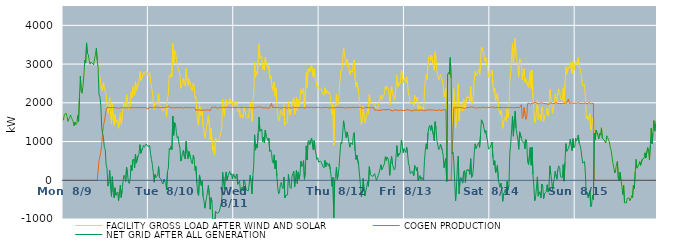
| Category | FACILITY GROSS LOAD AFTER WIND AND SOLAR | COGEN PRODUCTION | NET GRID AFTER ALL GENERATION |
|---|---|---|---|
|  Mon  8/9 | 1549 | 0 | 1549 |
|  Mon  8/9 | 1698 | 0 | 1698 |
|  Mon  8/9 | 1715 | 0 | 1715 |
|  Mon  8/9 | 1729 | 0 | 1729 |
|  Mon  8/9 | 1647 | 0 | 1647 |
|  Mon  8/9 | 1519 | 0 | 1519 |
|  Mon  8/9 | 1544 | 0 | 1544 |
|  Mon  8/9 | 1624 | 0 | 1624 |
|  Mon  8/9 | 1687 | 0 | 1687 |
|  Mon  8/9 | 1622 | 0 | 1622 |
|  Mon  8/9 | 1567 | 0 | 1567 |
|  Mon  8/9 | 1515 | 0 | 1515 |
|  Mon  8/9 | 1407 | 0 | 1407 |
|  Mon  8/9 | 1500 | 0 | 1500 |
|  Mon  8/9 | 1433 | 0 | 1433 |
|  Mon  8/9 | 1461 | 0 | 1461 |
|  Mon  8/9 | 1671 | 0 | 1671 |
|  Mon  8/9 | 1517 | 0 | 1517 |
|  Mon  8/9 | 2141 | 0 | 2141 |
|  Mon  8/9 | 2692 | 0 | 2692 |
|  Mon  8/9 | 2292 | 0 | 2292 |
|  Mon  8/9 | 2245 | 0 | 2245 |
|  Mon  8/9 | 2443 | 0 | 2443 |
|  Mon  8/9 | 2723 | 0 | 2723 |
|  Mon  8/9 | 3099 | 0 | 3099 |
|  Mon  8/9 | 3027 | 0 | 3027 |
|  Mon  8/9 | 3548 | 0 | 3548 |
|  Mon  8/9 | 3280 | 0 | 3280 |
|  Mon  8/9 | 3243 | 0 | 3243 |
|  Mon  8/9 | 3091 | 0 | 3091 |
|  Mon  8/9 | 2999 | 0 | 2999 |
|  Mon  8/9 | 3049 | 0 | 3049 |
|  Mon  8/9 | 3048 | 0 | 3048 |
|  Mon  8/9 | 3018 | 0 | 3018 |
|  Mon  8/9 | 2981 | 0 | 2981 |
|  Mon  8/9 | 3135 | 0 | 3135 |
|  Mon  8/9 | 3249 | 0 | 3249 |
|  Mon  8/9 | 3409 | 0 | 3409 |
|  Mon  8/9 | 3097 | 0 | 3097 |
|  Mon  8/9 | 2904 | 0 | 2904 |
|  Mon  8/9 | 2715 | 510 | 2205 |
|  Mon  8/9 | 2673 | 508 | 2165 |
|  Mon  8/9 | 2664 | 714 | 1950 |
|  Mon  8/9 | 2301 | 919 | 1382 |
|  Mon  8/9 | 2418 | 1216 | 1202 |
|  Mon  8/9 | 2520 | 1412 | 1108 |
|  Mon  8/9 | 2361 | 1520 | 841 |
|  Mon  8/9 | 2311 | 1512 | 799 |
|  Mon  8/9 | 2204 | 1807 | 397 |
|  Mon  8/9 | 2191 | 1880 | 311 |
|  Mon  8/9 | 1725 | 1876 | -151 |
|  Mon  8/9 | 1844 | 1881 | -37 |
|  Mon  8/9 | 2132 | 1875 | 257 |
|  Mon  8/9 | 1702 | 1873 | -171 |
|  Mon  8/9 | 1458 | 1877 | -419 |
|  Mon  8/9 | 1970 | 1877 | 93 |
|  Mon  8/9 | 1567 | 1875 | -308 |
|  Mon  8/9 | 1420 | 1874 | -454 |
|  Mon  8/9 | 1697 | 1892 | -195 |
|  Mon  8/9 | 1483 | 1870 | -387 |
|  Mon  8/9 | 1539 | 1871 | -332 |
|  Mon  8/9 | 1570 | 1872 | -302 |
|  Mon  8/9 | 1341 | 1867 | -526 |
|  Mon  8/9 | 1557 | 1857 | -300 |
|  Mon  8/9 | 1741 | 1864 | -123 |
|  Mon  8/9 | 1444 | 1887 | -443 |
|  Mon  8/9 | 1617 | 1871 | -254 |
|  Mon  8/9 | 1845 | 1868 | -23 |
|  Mon  8/9 | 2013 | 1884 | 129 |
|  Mon  8/9 | 1952 | 1875 | 77 |
|  Mon  8/9 | 1857 | 1889 | -32 |
|  Mon  8/9 | 2208 | 1871 | 337 |
|  Mon  8/9 | 2066 | 1881 | 185 |
|  Mon  8/9 | 1825 | 1872 | -47 |
|  Mon  8/9 | 1801 | 1884 | -83 |
|  Mon  8/9 | 1891 | 1874 | 17 |
|  Mon  8/9 | 2269 | 1884 | 385 |
|  Mon  8/9 | 2128 | 1880 | 248 |
|  Mon  8/9 | 2413 | 1888 | 525 |
|  Mon  8/9 | 2423 | 1871 | 552 |
|  Mon  8/9 | 2184 | 1867 | 317 |
|  Mon  8/9 | 2553 | 1875 | 678 |
|  Mon  8/9 | 2318 | 1876 | 442 |
|  Mon  8/9 | 2337 | 1878 | 459 |
|  Mon  8/9 | 2484 | 1853 | 631 |
|  Mon  8/9 | 2557 | 1871 | 686 |
|  Mon  8/9 | 2810 | 1890 | 920 |
|  Mon  8/9 | 2579 | 1883 | 696 |
|  Mon  8/9 | 2561 | 1867 | 694 |
|  Mon  8/9 | 2705 | 1873 | 832 |
|  Mon  8/9 | 2787 | 1883 | 904 |
|  Mon  8/9 | 2730 | 1876 | 854 |
|  Mon  8/9 | 2799 | 1896 | 903 |
|  Mon  8/9 | 2812 | 1873 | 939 |
|  Mon  8/9 | 2809 | 1879 | 930 |
|  Mon  8/9 | 2712 | 1840 | 872 |
|  Tue  8/10 | 2758 | 1884 | 874 |
|  Tue  8/10 | 2785 | 1892 | 893 |
|  Tue  8/10 | 2564 | 1881 | 683 |
|  Tue  8/10 | 2409 | 1871 | 538 |
|  Tue  8/10 | 2284 | 1875 | 409 |
|  Tue  8/10 | 2048 | 1860 | 188 |
|  Tue  8/10 | 1835 | 1885 | -50 |
|  Tue  8/10 | 2022 | 1870 | 152 |
|  Tue  8/10 | 1964 | 1892 | 72 |
|  Tue  8/10 | 1989 | 1890 | 99 |
|  Tue  8/10 | 2014 | 1873 | 141 |
|  Tue  8/10 | 2239 | 1883 | 356 |
|  Tue  8/10 | 1958 | 1881 | 77 |
|  Tue  8/10 | 1936 | 1879 | 57 |
|  Tue  8/10 | 1887 | 1876 | 11 |
|  Tue  8/10 | 1807 | 1874 | -67 |
|  Tue  8/10 | 1780 | 1876 | -96 |
|  Tue  8/10 | 1897 | 1870 | 27 |
|  Tue  8/10 | 1842 | 1881 | -39 |
|  Tue  8/10 | 1812 | 1893 | -81 |
|  Tue  8/10 | 1635 | 1879 | -244 |
|  Tue  8/10 | 2098 | 1874 | 224 |
|  Tue  8/10 | 2231 | 1915 | 316 |
|  Tue  8/10 | 2707 | 1886 | 821 |
|  Tue  8/10 | 2660 | 1876 | 784 |
|  Tue  8/10 | 2751 | 1871 | 880 |
|  Tue  8/10 | 2669 | 1874 | 795 |
|  Tue  8/10 | 3529 | 1874 | 1655 |
|  Tue  8/10 | 3023 | 1864 | 1159 |
|  Tue  8/10 | 3361 | 1871 | 1490 |
|  Tue  8/10 | 3327 | 1870 | 1457 |
|  Tue  8/10 | 3115 | 1882 | 1233 |
|  Tue  8/10 | 2992 | 1897 | 1095 |
|  Tue  8/10 | 3001 | 1873 | 1128 |
|  Tue  8/10 | 2812 | 1877 | 935 |
|  Tue  8/10 | 2713 | 1876 | 837 |
|  Tue  8/10 | 2373 | 1878 | 495 |
|  Tue  8/10 | 2470 | 1876 | 594 |
|  Tue  8/10 | 2578 | 1863 | 715 |
|  Tue  8/10 | 2643 | 1863 | 780 |
|  Tue  8/10 | 2469 | 1873 | 596 |
|  Tue  8/10 | 2432 | 1884 | 548 |
|  Tue  8/10 | 2890 | 1886 | 1004 |
|  Tue  8/10 | 2577 | 1874 | 703 |
|  Tue  8/10 | 2447 | 1893 | 554 |
|  Tue  8/10 | 2617 | 1872 | 745 |
|  Tue  8/10 | 2611 | 1872 | 739 |
|  Tue  8/10 | 2451 | 1874 | 577 |
|  Tue  8/10 | 2337 | 1878 | 459 |
|  Tue  8/10 | 2303 | 1877 | 426 |
|  Tue  8/10 | 2513 | 1868 | 645 |
|  Tue  8/10 | 2430 | 1883 | 547 |
|  Tue  8/10 | 2130 | 1873 | 257 |
|  Tue  8/10 | 2163 | 1806 | 357 |
|  Tue  8/10 | 1747 | 1812 | -65 |
|  Tue  8/10 | 1475 | 1816 | -341 |
|  Tue  8/10 | 1426 | 1817 | -391 |
|  Tue  8/10 | 1952 | 1814 | 138 |
|  Tue  8/10 | 1928 | 1799 | 129 |
|  Tue  8/10 | 1670 | 1804 | -134 |
|  Tue  8/10 | 1786 | 1811 | -25 |
|  Tue  8/10 | 1395 | 1815 | -420 |
|  Tue  8/10 | 1285 | 1815 | -530 |
|  Tue  8/10 | 1086 | 1807 | -721 |
|  Tue  8/10 | 1249 | 1806 | -557 |
|  Tue  8/10 | 1371 | 1818 | -447 |
|  Tue  8/10 | 1370 | 1811 | -441 |
|  Tue  8/10 | 1681 | 1813 | -132 |
|  Tue  8/10 | 1430 | 1811 | -381 |
|  Tue  8/10 | 1052 | 1800 | -748 |
|  Tue  8/10 | 1347 | 1797 | -450 |
|  Tue  8/10 | 1356 | 1892 | -536 |
|  Tue  8/10 | 762 | 1867 | -1105 |
|  Tue  8/10 | 876 | 1874 | -998 |
|  Tue  8/10 | 651 | 1862 | -1211 |
|  Tue  8/10 | 1095 | 1896 | -801 |
|  Tue  8/10 | 1059 | 1867 | -808 |
|  Tue  8/10 | 1010 | 1865 | -855 |
|  Tue  8/10 | 1009 | 1863 | -854 |
|  Tue  8/10 | 1065 | 1888 | -823 |
|  Tue  8/10 | 1140 | 1887 | -747 |
|  Tue  8/10 | 1129 | 1888 | -759 |
|  Tue  8/10 | 1323 | 1866 | -543 |
|  Tue  8/10 | 2088 | 1874 | 214 |
|  Tue  8/10 | 1830 | 1887 | -57 |
|  Tue  8/10 | 1656 | 1888 | -232 |
|  Tue  8/10 | 1959 | 1873 | 86 |
|  Tue  8/10 | 2089 | 1874 | 215 |
|  Tue  8/10 | 1898 | 1896 | 2 |
|  Tue  8/10 | 1985 | 1872 | 113 |
|  Tue  8/10 | 2012 | 1882 | 130 |
|  Tue  8/10 | 2112 | 1880 | 232 |
|  Tue  8/10 | 2011 | 1872 | 139 |
|  Tue  8/10 | 2057 | 1886 | 171 |
|  Tue  8/10 | 1918 | 1887 | 31 |
|  Tue  8/10 | 2042 | 1877 | 165 |
|  Wed  8/11 | 2014 | 1879 | 135 |
|  Wed  8/11 | 1923 | 1879 | 44 |
|  Wed  8/11 | 1927 | 1870 | 57 |
|  Wed  8/11 | 2033 | 1870 | 163 |
|  Wed  8/11 | 1785 | 1889 | -104 |
|  Wed  8/11 | 1751 | 1874 | -123 |
|  Wed  8/11 | 1858 | 1872 | -14 |
|  Wed  8/11 | 1618 | 1879 | -261 |
|  Wed  8/11 | 1611 | 1885 | -274 |
|  Wed  8/11 | 1689 | 1862 | -173 |
|  Wed  8/11 | 1611 | 1879 | -268 |
|  Wed  8/11 | 1900 | 1891 | 9 |
|  Wed  8/11 | 1841 | 1878 | -37 |
|  Wed  8/11 | 1684 | 1872 | -188 |
|  Wed  8/11 | 1615 | 1872 | -257 |
|  Wed  8/11 | 1594 | 1871 | -277 |
|  Wed  8/11 | 1605 | 1878 | -273 |
|  Wed  8/11 | 1597 | 1884 | -287 |
|  Wed  8/11 | 2007 | 1876 | 131 |
|  Wed  8/11 | 1835 | 1865 | -30 |
|  Wed  8/11 | 1523 | 1875 | -352 |
|  Wed  8/11 | 1979 | 1877 | 102 |
|  Wed  8/11 | 2258 | 1870 | 388 |
|  Wed  8/11 | 3043 | 1870 | 1173 |
|  Wed  8/11 | 2656 | 1878 | 778 |
|  Wed  8/11 | 2802 | 1869 | 933 |
|  Wed  8/11 | 2721 | 1886 | 835 |
|  Wed  8/11 | 3099 | 1877 | 1222 |
|  Wed  8/11 | 3525 | 1892 | 1633 |
|  Wed  8/11 | 3135 | 1872 | 1263 |
|  Wed  8/11 | 3126 | 1883 | 1243 |
|  Wed  8/11 | 3199 | 1874 | 1325 |
|  Wed  8/11 | 2869 | 1870 | 999 |
|  Wed  8/11 | 2984 | 1875 | 1109 |
|  Wed  8/11 | 2843 | 1877 | 966 |
|  Wed  8/11 | 3175 | 1876 | 1299 |
|  Wed  8/11 | 2994 | 1870 | 1124 |
|  Wed  8/11 | 2963 | 1872 | 1091 |
|  Wed  8/11 | 2890 | 1861 | 1029 |
|  Wed  8/11 | 2947 | 1858 | 1089 |
|  Wed  8/11 | 2617 | 1871 | 746 |
|  Wed  8/11 | 2723 | 1939 | 784 |
|  Wed  8/11 | 2703 | 1990 | 713 |
|  Wed  8/11 | 2367 | 1880 | 487 |
|  Wed  8/11 | 2312 | 1874 | 438 |
|  Wed  8/11 | 2536 | 1880 | 656 |
|  Wed  8/11 | 2167 | 1868 | 299 |
|  Wed  8/11 | 2388 | 1880 | 508 |
|  Wed  8/11 | 2002 | 1887 | 115 |
|  Wed  8/11 | 1679 | 1875 | -196 |
|  Wed  8/11 | 1530 | 1885 | -355 |
|  Wed  8/11 | 1572 | 1876 | -304 |
|  Wed  8/11 | 1781 | 1887 | -106 |
|  Wed  8/11 | 1814 | 1867 | -53 |
|  Wed  8/11 | 1697 | 1874 | -177 |
|  Wed  8/11 | 1666 | 1881 | -215 |
|  Wed  8/11 | 1954 | 1869 | 85 |
|  Wed  8/11 | 1422 | 1877 | -455 |
|  Wed  8/11 | 1479 | 1877 | -398 |
|  Wed  8/11 | 1488 | 1861 | -373 |
|  Wed  8/11 | 1494 | 1874 | -380 |
|  Wed  8/11 | 2032 | 1877 | 155 |
|  Wed  8/11 | 1826 | 1891 | -65 |
|  Wed  8/11 | 1681 | 1869 | -188 |
|  Wed  8/11 | 1664 | 1882 | -218 |
|  Wed  8/11 | 1966 | 1865 | 101 |
|  Wed  8/11 | 1949 | 1853 | 96 |
|  Wed  8/11 | 2131 | 1899 | 232 |
|  Wed  8/11 | 1699 | 1871 | -172 |
|  Wed  8/11 | 1916 | 1865 | 51 |
|  Wed  8/11 | 2140 | 1880 | 260 |
|  Wed  8/11 | 1797 | 1880 | -83 |
|  Wed  8/11 | 2084 | 1867 | 217 |
|  Wed  8/11 | 1897 | 1870 | 27 |
|  Wed  8/11 | 2032 | 1882 | 150 |
|  Wed  8/11 | 2362 | 1869 | 493 |
|  Wed  8/11 | 2234 | 1877 | 357 |
|  Wed  8/11 | 2278 | 1875 | 403 |
|  Wed  8/11 | 2384 | 1876 | 508 |
|  Wed  8/11 | 1899 | 1874 | 25 |
|  Wed  8/11 | 2068 | 1861 | 207 |
|  Wed  8/11 | 2780 | 1891 | 889 |
|  Wed  8/11 | 2398 | 1875 | 523 |
|  Wed  8/11 | 2871 | 1884 | 987 |
|  Wed  8/11 | 2898 | 1868 | 1030 |
|  Wed  8/11 | 2797 | 1875 | 922 |
|  Wed  8/11 | 2900 | 1873 | 1027 |
|  Wed  8/11 | 2976 | 1885 | 1091 |
|  Wed  8/11 | 2962 | 1880 | 1082 |
|  Wed  8/11 | 2666 | 1876 | 790 |
|  Wed  8/11 | 2881 | 1857 | 1024 |
|  Wed  8/11 | 2671 | 1877 | 794 |
|  Wed  8/11 | 2562 | 1883 | 679 |
|  Wed  8/11 | 2412 | 1878 | 534 |
|  Wed  8/11 | 2463 | 1882 | 581 |
|  Wed  8/11 | 2352 | 1885 | 467 |
|  Thu  8/12 | 2364 | 1900 | 464 |
|  Thu  8/12 | 2366 | 1869 | 497 |
|  Thu  8/12 | 2337 | 1875 | 462 |
|  Thu  8/12 | 2341 | 1878 | 463 |
|  Thu  8/12 | 2224 | 1873 | 351 |
|  Thu  8/12 | 2195 | 1876 | 319 |
|  Thu  8/12 | 2391 | 1876 | 515 |
|  Thu  8/12 | 2235 | 1882 | 353 |
|  Thu  8/12 | 2328 | 1870 | 458 |
|  Thu  8/12 | 2308 | 1878 | 430 |
|  Thu  8/12 | 2229 | 1862 | 367 |
|  Thu  8/12 | 2291 | 1858 | 433 |
|  Thu  8/12 | 2180 | 1891 | 289 |
|  Thu  8/12 | 1986 | 1881 | 105 |
|  Thu  8/12 | 1707 | 1863 | -156 |
|  Thu  8/12 | 1953 | 1881 | 72 |
|  Thu  8/12 | 907 | 1877 | -970 |
|  Thu  8/12 | 1865 | 1876 | -11 |
|  Thu  8/12 | 1967 | 1870 | 97 |
|  Thu  8/12 | 2219 | 1877 | 342 |
|  Thu  8/12 | 1907 | 1889 | 18 |
|  Thu  8/12 | 2028 | 1864 | 164 |
|  Thu  8/12 | 2226 | 1878 | 348 |
|  Thu  8/12 | 2577 | 1881 | 696 |
|  Thu  8/12 | 2854 | 1879 | 975 |
|  Thu  8/12 | 2821 | 1877 | 944 |
|  Thu  8/12 | 3084 | 1878 | 1206 |
|  Thu  8/12 | 3416 | 1880 | 1536 |
|  Thu  8/12 | 3243 | 1869 | 1374 |
|  Thu  8/12 | 3095 | 1872 | 1223 |
|  Thu  8/12 | 2968 | 1868 | 1100 |
|  Thu  8/12 | 3118 | 1869 | 1249 |
|  Thu  8/12 | 3009 | 1878 | 1131 |
|  Thu  8/12 | 3004 | 1880 | 1124 |
|  Thu  8/12 | 2730 | 1875 | 855 |
|  Thu  8/12 | 2838 | 1869 | 969 |
|  Thu  8/12 | 2817 | 1873 | 944 |
|  Thu  8/12 | 2794 | 1874 | 920 |
|  Thu  8/12 | 3040 | 1884 | 1156 |
|  Thu  8/12 | 3108 | 1877 | 1231 |
|  Thu  8/12 | 2637 | 1877 | 760 |
|  Thu  8/12 | 2409 | 1875 | 534 |
|  Thu  8/12 | 2525 | 1877 | 648 |
|  Thu  8/12 | 2511 | 1872 | 639 |
|  Thu  8/12 | 2277 | 1886 | 391 |
|  Thu  8/12 | 2279 | 1886 | 393 |
|  Thu  8/12 | 1766 | 1880 | -114 |
|  Thu  8/12 | 1443 | 1869 | -426 |
|  Thu  8/12 | 1571 | 1866 | -295 |
|  Thu  8/12 | 1920 | 1873 | 47 |
|  Thu  8/12 | 1647 | 1858 | -211 |
|  Thu  8/12 | 1481 | 1886 | -405 |
|  Thu  8/12 | 1584 | 1862 | -278 |
|  Thu  8/12 | 1688 | 1876 | -188 |
|  Thu  8/12 | 1836 | 1872 | -36 |
|  Thu  8/12 | 1724 | 1880 | -156 |
|  Thu  8/12 | 2223 | 1872 | 351 |
|  Thu  8/12 | 2028 | 1872 | 156 |
|  Thu  8/12 | 1980 | 1859 | 121 |
|  Thu  8/12 | 1995 | 1875 | 120 |
|  Thu  8/12 | 1987 | 1886 | 101 |
|  Thu  8/12 | 1985 | 1875 | 110 |
|  Thu  8/12 | 1981 | 1811 | 170 |
|  Thu  8/12 | 1882 | 1802 | 80 |
|  Thu  8/12 | 1814 | 1814 | 0 |
|  Thu  8/12 | 1842 | 1795 | 47 |
|  Thu  8/12 | 1936 | 1810 | 126 |
|  Thu  8/12 | 1993 | 1810 | 183 |
|  Thu  8/12 | 1970 | 1801 | 169 |
|  Thu  8/12 | 2202 | 1801 | 401 |
|  Thu  8/12 | 2087 | 1818 | 269 |
|  Thu  8/12 | 2134 | 1816 | 318 |
|  Thu  8/12 | 2134 | 1822 | 312 |
|  Thu  8/12 | 2236 | 1808 | 428 |
|  Thu  8/12 | 2427 | 1820 | 607 |
|  Thu  8/12 | 2347 | 1832 | 515 |
|  Thu  8/12 | 2422 | 1820 | 602 |
|  Thu  8/12 | 2374 | 1802 | 572 |
|  Thu  8/12 | 2262 | 1827 | 435 |
|  Thu  8/12 | 1946 | 1818 | 128 |
|  Thu  8/12 | 2293 | 1811 | 482 |
|  Thu  8/12 | 2435 | 1819 | 616 |
|  Thu  8/12 | 2200 | 1791 | 409 |
|  Thu  8/12 | 2233 | 1815 | 418 |
|  Thu  8/12 | 2073 | 1809 | 264 |
|  Thu  8/12 | 2113 | 1814 | 299 |
|  Thu  8/12 | 2425 | 1822 | 603 |
|  Thu  8/12 | 2707 | 1811 | 896 |
|  Thu  8/12 | 2409 | 1800 | 609 |
|  Thu  8/12 | 2517 | 1821 | 696 |
|  Thu  8/12 | 2466 | 1806 | 660 |
|  Thu  8/12 | 2542 | 1814 | 728 |
|  Thu  8/12 | 2852 | 1811 | 1041 |
|  Thu  8/12 | 2722 | 1812 | 910 |
|  Thu  8/12 | 2513 | 1802 | 711 |
|  Thu  8/12 | 2605 | 1788 | 817 |
|  Fri  8/13 | 2631 | 1804 | 827 |
|  Fri  8/13 | 2515 | 1797 | 718 |
|  Fri  8/13 | 2672 | 1820 | 852 |
|  Fri  8/13 | 2493 | 1809 | 684 |
|  Fri  8/13 | 2256 | 1815 | 441 |
|  Fri  8/13 | 2161 | 1804 | 357 |
|  Fri  8/13 | 1977 | 1805 | 172 |
|  Fri  8/13 | 2006 | 1809 | 197 |
|  Fri  8/13 | 2018 | 1789 | 229 |
|  Fri  8/13 | 2012 | 1808 | 204 |
|  Fri  8/13 | 1926 | 1807 | 119 |
|  Fri  8/13 | 2194 | 1811 | 383 |
|  Fri  8/13 | 2162 | 1816 | 346 |
|  Fri  8/13 | 2052 | 1808 | 244 |
|  Fri  8/13 | 2145 | 1811 | 334 |
|  Fri  8/13 | 1796 | 1807 | -11 |
|  Fri  8/13 | 1874 | 1809 | 65 |
|  Fri  8/13 | 1939 | 1818 | 121 |
|  Fri  8/13 | 1832 | 1813 | 19 |
|  Fri  8/13 | 1894 | 1818 | 76 |
|  Fri  8/13 | 1887 | 1812 | 75 |
|  Fri  8/13 | 1811 | 1813 | -2 |
|  Fri  8/13 | 2297 | 1791 | 506 |
|  Fri  8/13 | 2602 | 1822 | 780 |
|  Fri  8/13 | 2736 | 1793 | 943 |
|  Fri  8/13 | 2595 | 1792 | 803 |
|  Fri  8/13 | 3052 | 1820 | 1232 |
|  Fri  8/13 | 3185 | 1814 | 1371 |
|  Fri  8/13 | 3235 | 1816 | 1419 |
|  Fri  8/13 | 3091 | 1806 | 1285 |
|  Fri  8/13 | 3230 | 1815 | 1415 |
|  Fri  8/13 | 3236 | 1816 | 1420 |
|  Fri  8/13 | 2986 | 1811 | 1175 |
|  Fri  8/13 | 2837 | 1821 | 1016 |
|  Fri  8/13 | 3320 | 1808 | 1512 |
|  Fri  8/13 | 3133 | 1801 | 1332 |
|  Fri  8/13 | 2829 | 1805 | 1024 |
|  Fri  8/13 | 2836 | 1807 | 1029 |
|  Fri  8/13 | 2594 | 1804 | 790 |
|  Fri  8/13 | 2655 | 1831 | 824 |
|  Fri  8/13 | 2736 | 1804 | 932 |
|  Fri  8/13 | 2735 | 1807 | 928 |
|  Fri  8/13 | 2581 | 1808 | 773 |
|  Fri  8/13 | 2456 | 1811 | 645 |
|  Fri  8/13 | 2149 | 1824 | 325 |
|  Fri  8/13 | 2284 | 1809 | 475 |
|  Fri  8/13 | 2385 | 1822 | 563 |
|  Fri  8/13 | 1782 | 1816 | -34 |
|  Fri  8/13 | 2729 | 0 | 2729 |
|  Fri  8/13 | 2783 | 0 | 2783 |
|  Fri  8/13 | 2733 | 0 | 2733 |
|  Fri  8/13 | 3169 | 0 | 3169 |
|  Fri  8/13 | 2635 | 0 | 2635 |
|  Fri  8/13 | 1391 | 711 | 680 |
|  Fri  8/13 | 1839 | 1112 | 727 |
|  Fri  8/13 | 2366 | 1876 | 490 |
|  Fri  8/13 | 1818 | 1851 | -33 |
|  Fri  8/13 | 1342 | 1873 | -531 |
|  Fri  8/13 | 1697 | 1876 | -179 |
|  Fri  8/13 | 2230 | 1872 | 358 |
|  Fri  8/13 | 2495 | 1871 | 624 |
|  Fri  8/13 | 1535 | 1882 | -347 |
|  Fri  8/13 | 1909 | 1888 | 21 |
|  Fri  8/13 | 1950 | 1876 | 74 |
|  Fri  8/13 | 1872 | 1886 | -14 |
|  Fri  8/13 | 1794 | 1869 | -75 |
|  Fri  8/13 | 2099 | 1886 | 213 |
|  Fri  8/13 | 2102 | 1850 | 252 |
|  Fri  8/13 | 1809 | 1868 | -59 |
|  Fri  8/13 | 2089 | 1871 | 218 |
|  Fri  8/13 | 2164 | 1885 | 279 |
|  Fri  8/13 | 2117 | 1879 | 238 |
|  Fri  8/13 | 2156 | 1879 | 277 |
|  Fri  8/13 | 2037 | 1886 | 151 |
|  Fri  8/13 | 2432 | 1877 | 555 |
|  Fri  8/13 | 1965 | 1892 | 73 |
|  Fri  8/13 | 1997 | 1892 | 105 |
|  Fri  8/13 | 2184 | 1883 | 301 |
|  Fri  8/13 | 2583 | 1869 | 714 |
|  Fri  8/13 | 2811 | 1870 | 941 |
|  Fri  8/13 | 2694 | 1876 | 818 |
|  Fri  8/13 | 2688 | 1863 | 825 |
|  Fri  8/13 | 2805 | 1876 | 929 |
|  Fri  8/13 | 2855 | 1882 | 973 |
|  Fri  8/13 | 2718 | 1869 | 849 |
|  Fri  8/13 | 3034 | 1868 | 1166 |
|  Fri  8/13 | 3439 | 1878 | 1561 |
|  Fri  8/13 | 3450 | 1884 | 1566 |
|  Fri  8/13 | 3336 | 1878 | 1458 |
|  Fri  8/13 | 3227 | 1883 | 1344 |
|  Fri  8/13 | 3087 | 1861 | 1226 |
|  Fri  8/13 | 3156 | 1871 | 1285 |
|  Fri  8/13 | 2987 | 1872 | 1115 |
|  Fri  8/13 | 2899 | 1885 | 1014 |
|  Fri  8/13 | 2663 | 1860 | 803 |
|  Fri  8/13 | 2655 | 1877 | 778 |
|  Sat  8/14 | 2712 | 1860 | 852 |
|  Sat  8/14 | 2758 | 1889 | 869 |
|  Sat  8/14 | 2851 | 1868 | 983 |
|  Sat  8/14 | 2479 | 1890 | 589 |
|  Sat  8/14 | 2280 | 1887 | 393 |
|  Sat  8/14 | 2374 | 1868 | 506 |
|  Sat  8/14 | 2062 | 1868 | 194 |
|  Sat  8/14 | 2174 | 1881 | 293 |
|  Sat  8/14 | 2259 | 1874 | 385 |
|  Sat  8/14 | 1920 | 1876 | 44 |
|  Sat  8/14 | 1787 | 1884 | -97 |
|  Sat  8/14 | 1694 | 1876 | -182 |
|  Sat  8/14 | 1799 | 1875 | -76 |
|  Sat  8/14 | 1645 | 1878 | -233 |
|  Sat  8/14 | 1340 | 1883 | -543 |
|  Sat  8/14 | 1528 | 1880 | -352 |
|  Sat  8/14 | 1565 | 1869 | -304 |
|  Sat  8/14 | 1640 | 1876 | -236 |
|  Sat  8/14 | 1525 | 1877 | -352 |
|  Sat  8/14 | 1851 | 1877 | -26 |
|  Sat  8/14 | 1626 | 1874 | -248 |
|  Sat  8/14 | 1749 | 1869 | -120 |
|  Sat  8/14 | 2594 | 1882 | 712 |
|  Sat  8/14 | 2811 | 1880 | 931 |
|  Sat  8/14 | 3185 | 1873 | 1312 |
|  Sat  8/14 | 3528 | 1876 | 1652 |
|  Sat  8/14 | 3010 | 1872 | 1138 |
|  Sat  8/14 | 3420 | 1869 | 1551 |
|  Sat  8/14 | 3665 | 1883 | 1782 |
|  Sat  8/14 | 3225 | 1880 | 1345 |
|  Sat  8/14 | 3084 | 1900 | 1184 |
|  Sat  8/14 | 2931 | 1876 | 1055 |
|  Sat  8/14 | 2675 | 1875 | 800 |
|  Sat  8/14 | 3132 | 1881 | 1251 |
|  Sat  8/14 | 3129 | 1881 | 1248 |
|  Sat  8/14 | 3042 | 1953 | 1089 |
|  Sat  8/14 | 2592 | 1595 | 997 |
|  Sat  8/14 | 2607 | 1636 | 971 |
|  Sat  8/14 | 2881 | 1878 | 1003 |
|  Sat  8/14 | 2534 | 1726 | 808 |
|  Sat  8/14 | 2624 | 1572 | 1052 |
|  Sat  8/14 | 2610 | 1630 | 980 |
|  Sat  8/14 | 2456 | 1979 | 477 |
|  Sat  8/14 | 2384 | 1979 | 405 |
|  Sat  8/14 | 2403 | 1993 | 410 |
|  Sat  8/14 | 2808 | 1963 | 845 |
|  Sat  8/14 | 2371 | 1983 | 388 |
|  Sat  8/14 | 2847 | 1994 | 853 |
|  Sat  8/14 | 2135 | 1982 | 153 |
|  Sat  8/14 | 1832 | 1984 | -152 |
|  Sat  8/14 | 1485 | 2015 | -530 |
|  Sat  8/14 | 1564 | 1991 | -427 |
|  Sat  8/14 | 1822 | 1995 | -173 |
|  Sat  8/14 | 2078 | 1990 | 88 |
|  Sat  8/14 | 1562 | 1974 | -412 |
|  Sat  8/14 | 1659 | 1994 | -335 |
|  Sat  8/14 | 1703 | 1998 | -295 |
|  Sat  8/14 | 1535 | 1991 | -456 |
|  Sat  8/14 | 1895 | 1994 | -99 |
|  Sat  8/14 | 1827 | 1990 | -163 |
|  Sat  8/14 | 1513 | 1986 | -473 |
|  Sat  8/14 | 1663 | 2009 | -346 |
|  Sat  8/14 | 1661 | 1980 | -319 |
|  Sat  8/14 | 1708 | 1992 | -284 |
|  Sat  8/14 | 1856 | 1971 | -115 |
|  Sat  8/14 | 1667 | 1973 | -306 |
|  Sat  8/14 | 1753 | 1963 | -210 |
|  Sat  8/14 | 2355 | 1982 | 373 |
|  Sat  8/14 | 2167 | 2000 | 167 |
|  Sat  8/14 | 1984 | 1977 | 7 |
|  Sat  8/14 | 1732 | 1985 | -253 |
|  Sat  8/14 | 1901 | 1972 | -71 |
|  Sat  8/14 | 2020 | 1982 | 38 |
|  Sat  8/14 | 2227 | 1994 | 233 |
|  Sat  8/14 | 2107 | 2007 | 100 |
|  Sat  8/14 | 2013 | 1987 | 26 |
|  Sat  8/14 | 2265 | 1981 | 284 |
|  Sat  8/14 | 2361 | 1989 | 372 |
|  Sat  8/14 | 2314 | 1983 | 331 |
|  Sat  8/14 | 2098 | 2006 | 92 |
|  Sat  8/14 | 2098 | 1981 | 117 |
|  Sat  8/14 | 2071 | 2004 | 67 |
|  Sat  8/14 | 2385 | 1981 | 404 |
|  Sat  8/14 | 1960 | 1983 | -23 |
|  Sat  8/14 | 2459 | 1995 | 464 |
|  Sat  8/14 | 2933 | 1987 | 946 |
|  Sat  8/14 | 2739 | 1991 | 748 |
|  Sat  8/14 | 2760 | 1989 | 771 |
|  Sat  8/14 | 2928 | 2098 | 830 |
|  Sat  8/14 | 2901 | 1982 | 919 |
|  Sat  8/14 | 3040 | 1974 | 1066 |
|  Sat  8/14 | 3063 | 2002 | 1061 |
|  Sat  8/14 | 2752 | 1986 | 766 |
|  Sat  8/14 | 3061 | 1986 | 1075 |
|  Sat  8/14 | 2843 | 2005 | 838 |
|  Sat  8/14 | 2862 | 1993 | 869 |
|  Sun  8/15 | 3077 | 1995 | 1082 |
|  Sun  8/15 | 2996 | 1987 | 1009 |
|  Sun  8/15 | 3053 | 1986 | 1067 |
|  Sun  8/15 | 3172 | 2002 | 1170 |
|  Sun  8/15 | 2953 | 2006 | 947 |
|  Sun  8/15 | 2891 | 1985 | 906 |
|  Sun  8/15 | 2778 | 1991 | 787 |
|  Sun  8/15 | 2591 | 1989 | 602 |
|  Sun  8/15 | 2435 | 1991 | 444 |
|  Sun  8/15 | 2425 | 1983 | 442 |
|  Sun  8/15 | 2470 | 1986 | 484 |
|  Sun  8/15 | 2157 | 1998 | 159 |
|  Sun  8/15 | 1605 | 1975 | -370 |
|  Sun  8/15 | 1659 | 1969 | -310 |
|  Sun  8/15 | 1550 | 2000 | -450 |
|  Sun  8/15 | 1644 | 1999 | -355 |
|  Sun  8/15 | 1725 | 1996 | -271 |
|  Sun  8/15 | 1296 | 1977 | -681 |
|  Sun  8/15 | 1355 | 1978 | -623 |
|  Sun  8/15 | 1607 | 1988 | -381 |
|  Sun  8/15 | 1487 | 1985 | -498 |
|  Sun  8/15 | 1214 | 0 | 1214 |
|  Sun  8/15 | 1049 | 0 | 1049 |
|  Sun  8/15 | 1296 | 0 | 1296 |
|  Sun  8/15 | 1296 | 0 | 1296 |
|  Sun  8/15 | 1166 | 0 | 1166 |
|  Sun  8/15 | 1067 | 0 | 1067 |
|  Sun  8/15 | 1208 | 0 | 1208 |
|  Sun  8/15 | 1163 | 0 | 1163 |
|  Sun  8/15 | 1355 | 0 | 1355 |
|  Sun  8/15 | 1081 | 0 | 1081 |
|  Sun  8/15 | 1073 | 0 | 1073 |
|  Sun  8/15 | 1039 | 0 | 1039 |
|  Sun  8/15 | 1025 | 0 | 1025 |
|  Sun  8/15 | 964 | 0 | 964 |
|  Sun  8/15 | 1150 | 0 | 1150 |
|  Sun  8/15 | 1109 | 0 | 1109 |
|  Sun  8/15 | 1026 | 0 | 1026 |
|  Sun  8/15 | 992 | 0 | 992 |
|  Sun  8/15 | 840 | 0 | 840 |
|  Sun  8/15 | 762 | 0 | 762 |
|  Sun  8/15 | 771 | 0 | 771 |
|  Sun  8/15 | 427 | 0 | 427 |
|  Sun  8/15 | 322 | 0 | 322 |
|  Sun  8/15 | 189 | 0 | 189 |
|  Sun  8/15 | 274 | 0 | 274 |
|  Sun  8/15 | 416 | 0 | 416 |
|  Sun  8/15 | 489 | 0 | 489 |
|  Sun  8/15 | 42 | 0 | 42 |
|  Sun  8/15 | -14 | 0 | -14 |
|  Sun  8/15 | 211 | 0 | 211 |
|  Sun  8/15 | -3 | 0 | -3 |
|  Sun  8/15 | -151 | 0 | -151 |
|  Sun  8/15 | -370 | 0 | -370 |
|  Sun  8/15 | -132 | 0 | -132 |
|  Sun  8/15 | -580 | 0 | -580 |
|  Sun  8/15 | -599 | 0 | -599 |
|  Sun  8/15 | -587 | 0 | -587 |
|  Sun  8/15 | -468 | 0 | -468 |
|  Sun  8/15 | -492 | 0 | -492 |
|  Sun  8/15 | -456 | 0 | -456 |
|  Sun  8/15 | -529 | 0 | -529 |
|  Sun  8/15 | -483 | 0 | -483 |
|  Sun  8/15 | -397 | 0 | -397 |
|  Sun  8/15 | -450 | 0 | -450 |
|  Sun  8/15 | -123 | 0 | -123 |
|  Sun  8/15 | -211 | 0 | -211 |
|  Sun  8/15 | 221 | 0 | 221 |
|  Sun  8/15 | 539 | 0 | 539 |
|  Sun  8/15 | 310 | 0 | 310 |
|  Sun  8/15 | 332 | 0 | 332 |
|  Sun  8/15 | 400 | 0 | 400 |
|  Sun  8/15 | 482 | 0 | 482 |
|  Sun  8/15 | 386 | 0 | 386 |
|  Sun  8/15 | 385 | 0 | 385 |
|  Sun  8/15 | 546 | 0 | 546 |
|  Sun  8/15 | 534 | 0 | 534 |
|  Sun  8/15 | 569 | 0 | 569 |
|  Sun  8/15 | 711 | 0 | 711 |
|  Sun  8/15 | 573 | 0 | 573 |
|  Sun  8/15 | 587 | 0 | 587 |
|  Sun  8/15 | 842 | 0 | 842 |
|  Sun  8/15 | 749 | 0 | 749 |
|  Sun  8/15 | 525 | 0 | 525 |
|  Sun  8/15 | 899 | 0 | 899 |
|  Sun  8/15 | 1345 | 0 | 1345 |
|  Sun  8/15 | 937 | 0 | 937 |
|  Sun  8/15 | 1227 | 0 | 1227 |
|  Sun  8/15 | 1542 | 0 | 1542 |
|  Sun  8/15 | 1267 | 0 | 1267 |
|  Sun  8/15 | 1455 | 0 | 1455 |
|  Sun  8/15 | 1576 | 0 | 1576 |